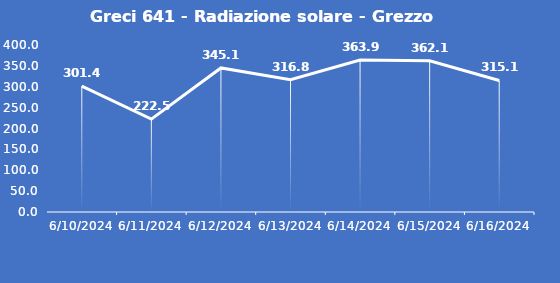
| Category | Greci 641 - Radiazione solare - Grezzo (W/m2) |
|---|---|
| 6/10/24 | 301.4 |
| 6/11/24 | 222.5 |
| 6/12/24 | 345.1 |
| 6/13/24 | 316.8 |
| 6/14/24 | 363.9 |
| 6/15/24 | 362.1 |
| 6/16/24 | 315.1 |